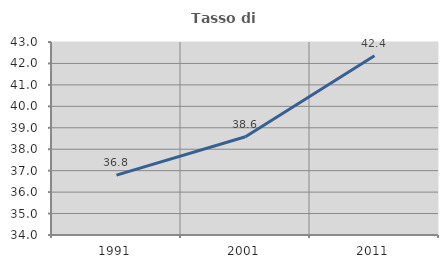
| Category | Tasso di occupazione   |
|---|---|
| 1991.0 | 36.791 |
| 2001.0 | 38.583 |
| 2011.0 | 42.356 |